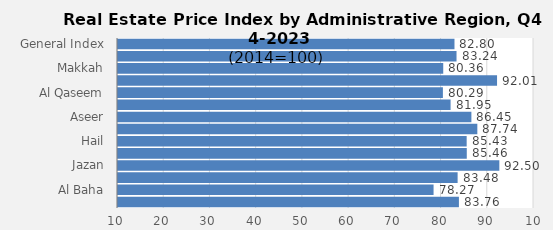
| Category | 2023 |
|---|---|
| General Index | 82.797 |
| Riyadh | 83.239 |
| Makkah | 80.364 |
| Madinah | 92.005 |
| Al Qaseem | 80.289 |
| Eastern Province | 81.952 |
| Aseer | 86.454 |
| Tabouk | 87.74 |
| Hail | 85.433 |
| Northern Borders | 85.457 |
| Jazan | 92.499 |
| Najran | 83.475 |
| Al Baha | 78.272 |
| Al Jouf | 83.756 |